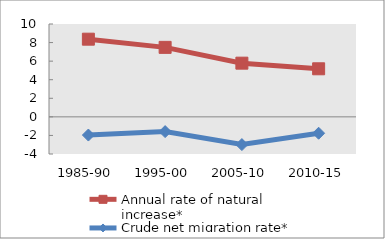
| Category | Annual rate of natural increase* | Crude net migration rate* |
|---|---|---|
| 1985-90 | 8.365 | -1.96 |
| 1995-00 | 7.484 | -1.589 |
| 2005-10 | 5.783 | -2.986 |
| 2010-15 | 5.176 | -1.764 |